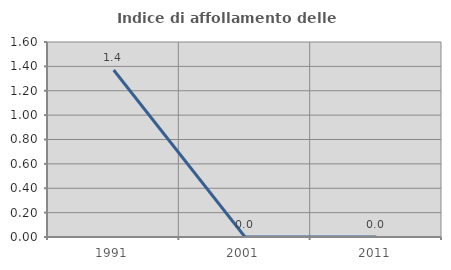
| Category | Indice di affollamento delle abitazioni  |
|---|---|
| 1991.0 | 1.37 |
| 2001.0 | 0 |
| 2011.0 | 0 |